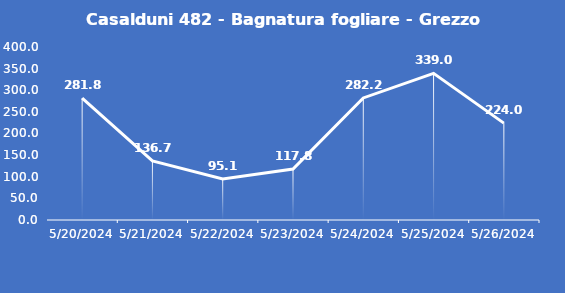
| Category | Casalduni 482 - Bagnatura fogliare - Grezzo (min) |
|---|---|
| 5/20/24 | 281.8 |
| 5/21/24 | 136.7 |
| 5/22/24 | 95.1 |
| 5/23/24 | 117.8 |
| 5/24/24 | 282.2 |
| 5/25/24 | 339 |
| 5/26/24 | 224 |